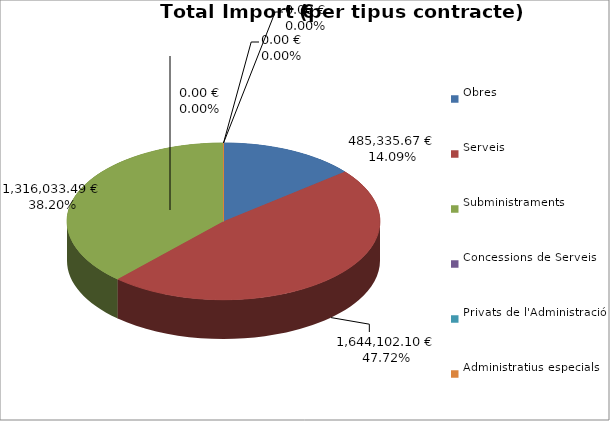
| Category | Total preu
(amb IVA) |
|---|---|
| Obres | 485335.67 |
| Serveis | 1644102.1 |
| Subministraments | 1316033.49 |
| Concessions de Serveis | 0 |
| Privats de l'Administració | 0 |
| Administratius especials | 0 |